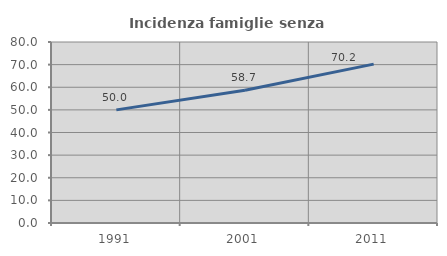
| Category | Incidenza famiglie senza nuclei |
|---|---|
| 1991.0 | 50 |
| 2001.0 | 58.654 |
| 2011.0 | 70.213 |